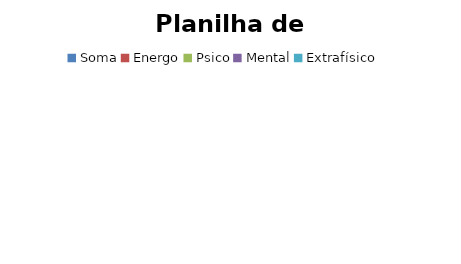
| Category | Total |
|---|---|
| Soma | 0 |
| Energo | 0 |
| Psico | 0 |
| Mental | 0 |
| Extrafísico | 0 |